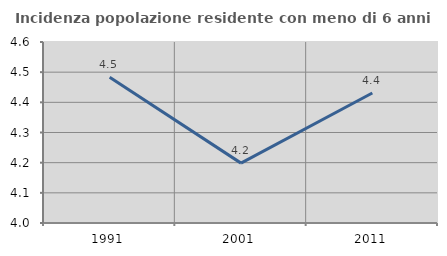
| Category | Incidenza popolazione residente con meno di 6 anni |
|---|---|
| 1991.0 | 4.483 |
| 2001.0 | 4.198 |
| 2011.0 | 4.431 |